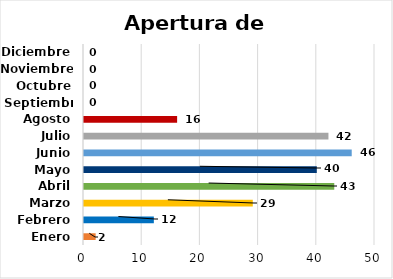
| Category | Apertura de cuenta  |
|---|---|
| Enero | 2 |
| Febrero | 12 |
| Marzo | 29 |
| Abril | 43 |
| Mayo | 40 |
| Junio | 46 |
| Julio | 42 |
| Agosto | 16 |
| Septiembre | 0 |
| Octubre | 0 |
| Noviembre | 0 |
| Diciembre | 0 |